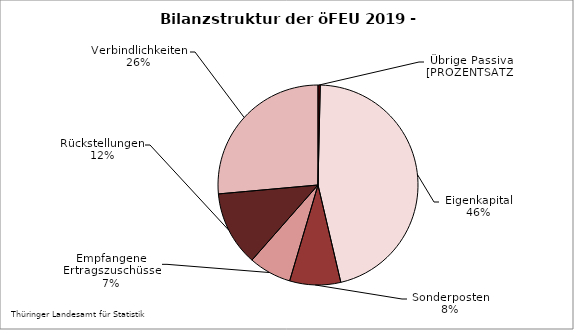
| Category | Series 0 |
|---|---|
| Übrige Passiva, Rechnungsab-grenzungsposten | 0.363 |
| Eigenkapital | 45.968 |
| SoPo mit Rücklageanteil, aus Zuwendungen und anderweitig nicht genannt | 8.24 |
| Empfangene Ertragszuschüsse | 6.904 |
| Rückstellungen | 12.098 |
| Verbindlichkeiten | 26.426 |